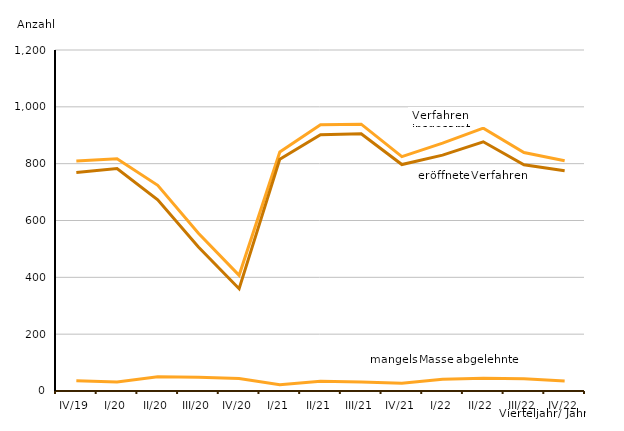
| Category | Series 0 | Series 1 | Series 2 | Series 3 |
|---|---|---|---|---|
| IV/19 |  | 809 | 769 | 36 |
| I/20 |  | 817 | 783 | 32 |
| II/20 |  | 724 | 673 | 50 |
| III/20 |  | 555 | 507 | 48 |
| IV/20 |  | 407 | 360 | 44 |
| I/21 |  | 841 | 816 | 22 |
| II/21 |  | 937 | 902 | 34 |
| III/21 |  | 939 | 905 | 32 |
| IV/21 |  | 825 | 797 | 27 |
| I/22 |  | 872 | 830 | 41 |
| II/22 |  | 925 | 877 | 45 |
| III/22 |  | 839 | 796 | 43 |
| IV/22 |  | 810 | 775 | 35 |